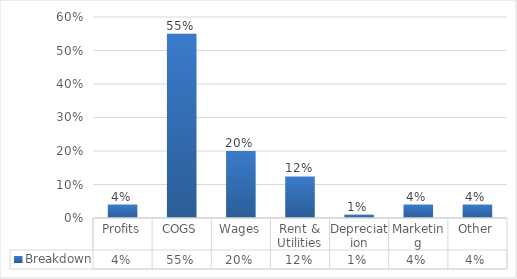
| Category | Breakdown |
|---|---|
| Profits | 0.04 |
| COGS | 0.55 |
| Wages | 0.2 |
| Rent & Utilities | 0.124 |
| Depreciation | 0.01 |
| Marketing | 0.04 |
| Other | 0.04 |